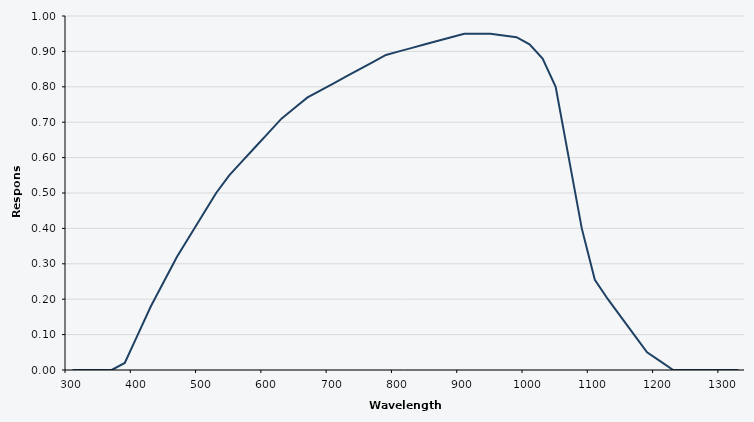
| Category | Series 0 |
|---|---|
| 300.0 | 0 |
| 320.0 | 0 |
| 340.0 | 0 |
| 360.0 | 0 |
| 380.0 | 0.02 |
| 400.0 | 0.1 |
| 420.0 | 0.18 |
| 440.0 | 0.25 |
| 460.0 | 0.32 |
| 480.0 | 0.38 |
| 500.0 | 0.44 |
| 520.0 | 0.5 |
| 540.0 | 0.55 |
| 560.0 | 0.59 |
| 580.0 | 0.63 |
| 600.0 | 0.67 |
| 620.0 | 0.71 |
| 640.0 | 0.74 |
| 660.0 | 0.77 |
| 680.0 | 0.79 |
| 700.0 | 0.81 |
| 720.0 | 0.83 |
| 740.0 | 0.85 |
| 760.0 | 0.87 |
| 780.0 | 0.89 |
| 800.0 | 0.9 |
| 820.0 | 0.91 |
| 840.0 | 0.92 |
| 860.0 | 0.93 |
| 880.0 | 0.94 |
| 900.0 | 0.95 |
| 920.0 | 0.95 |
| 940.0 | 0.95 |
| 960.0 | 0.945 |
| 980.0 | 0.94 |
| 1000.0 | 0.92 |
| 1020.0 | 0.88 |
| 1040.0 | 0.8 |
| 1060.0 | 0.6 |
| 1080.0 | 0.4 |
| 1100.0 | 0.255 |
| 1120.0 | 0.2 |
| 1140.0 | 0.15 |
| 1160.0 | 0.1 |
| 1180.0 | 0.05 |
| 1200.0 | 0.025 |
| 1220.0 | 0 |
| 1240.0 | 0 |
| 1260.0 | 0 |
| 1280.0 | 0 |
| 1300.0 | 0 |
| 1320.0 | 0 |